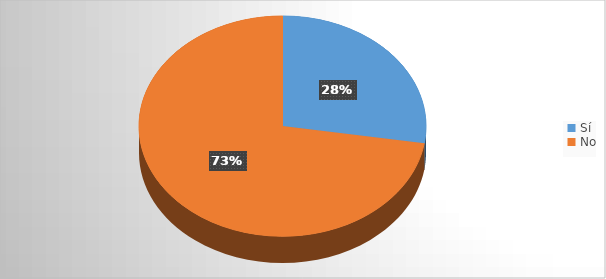
| Category | Series 0 |
|---|---|
| Sí | 11 |
| No | 29 |